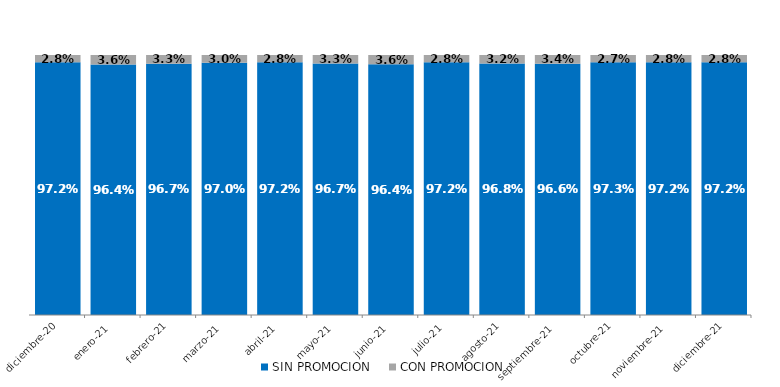
| Category | SIN PROMOCION   | CON PROMOCION   |
|---|---|---|
| 2020-12-01 | 0.972 | 0.028 |
| 2021-01-01 | 0.964 | 0.036 |
| 2021-02-01 | 0.967 | 0.033 |
| 2021-03-01 | 0.97 | 0.03 |
| 2021-04-01 | 0.972 | 0.028 |
| 2021-05-01 | 0.967 | 0.033 |
| 2021-06-01 | 0.964 | 0.036 |
| 2021-07-01 | 0.972 | 0.028 |
| 2021-08-01 | 0.968 | 0.032 |
| 2021-09-01 | 0.966 | 0.034 |
| 2021-10-01 | 0.973 | 0.027 |
| 2021-11-01 | 0.972 | 0.028 |
| 2021-12-01 | 0.972 | 0.028 |